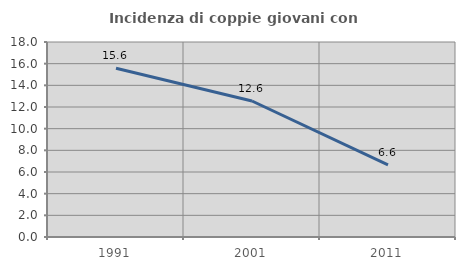
| Category | Incidenza di coppie giovani con figli |
|---|---|
| 1991.0 | 15.582 |
| 2001.0 | 12.552 |
| 2011.0 | 6.65 |